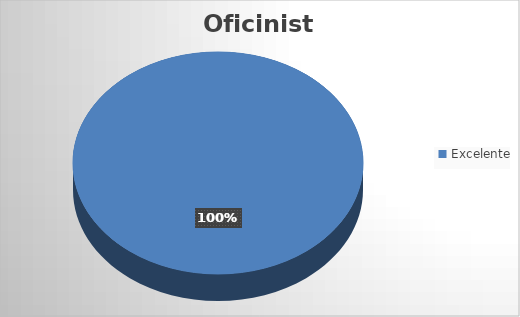
| Category | Cantidad |
|---|---|
| Excelente | 10 |